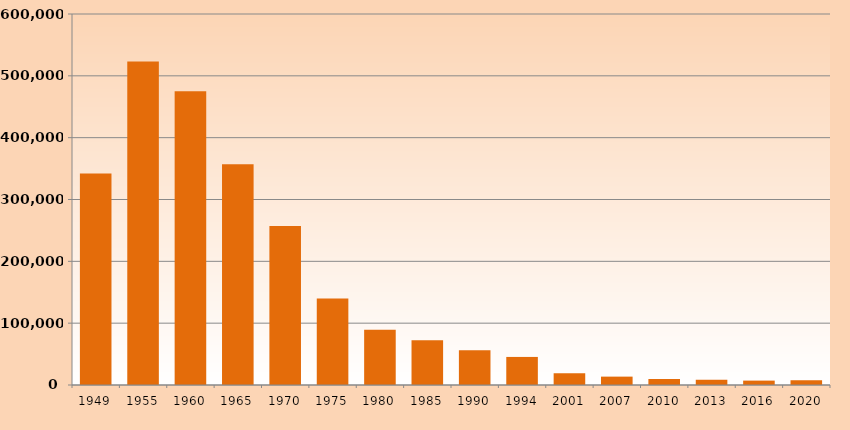
| Category | Series 1 |
|---|---|
| 1949.0 | 341917 |
| 1955.0 | 523113 |
| 1960.0 | 474876 |
| 1965.0 | 357118 |
| 1970.0 | 257086 |
| 1975.0 | 139723 |
| 1980.0 | 89373 |
| 1985.0 | 72200 |
| 1990.0 | 56114 |
| 1994.0 | 45395 |
| 2001.0 | 19198 |
| 2007.0 | 13544 |
| 2010.0 | 9717 |
| 2013.0 | 8600 |
| 2016.0 | 7103 |
| 2020.0 | 7507 |